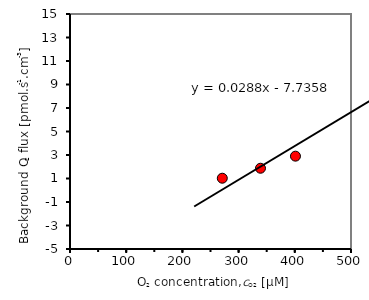
| Category | Series 0 |
|---|---|
| 623.2998 | 11.16 |
| 509.9515 | 6.018 |
| 401.1823 | 2.9 |
| 338.9527 | 1.873 |
| 270.9735 | 1.024 |